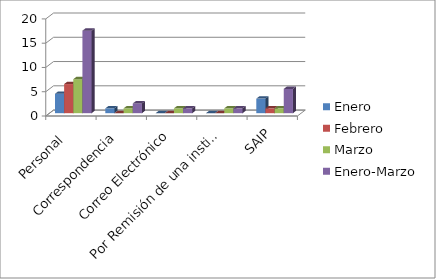
| Category | Enero | Febrero | Marzo | Enero-Marzo |
|---|---|---|---|---|
| Personal  | 4 | 6 | 7 | 17 |
| Correspondencia | 1 | 0 | 1 | 2 |
| Correo Electrónico | 0 | 0 | 1 | 1 |
| Por Remisión de una institución | 0 | 0 | 1 | 1 |
| SAIP | 3 | 1 | 1 | 5 |